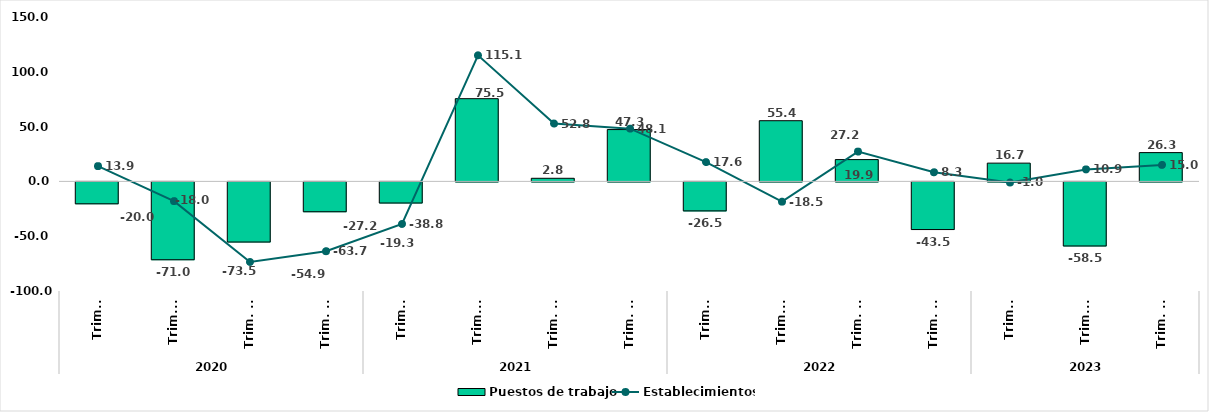
| Category | Puestos de trabajo |
|---|---|
| 0 | -20 |
| 1 | -71.038 |
| 2 | -54.872 |
| 3 | -27.24 |
| 4 | -19.271 |
| 5 | 75.472 |
| 6 | 2.841 |
| 7 | 47.291 |
| 8 | -26.452 |
| 9 | 55.376 |
| 10 | 19.89 |
| 11 | -43.478 |
| 12 | 16.667 |
| 13 | -58.478 |
| 14 | 26.267 |